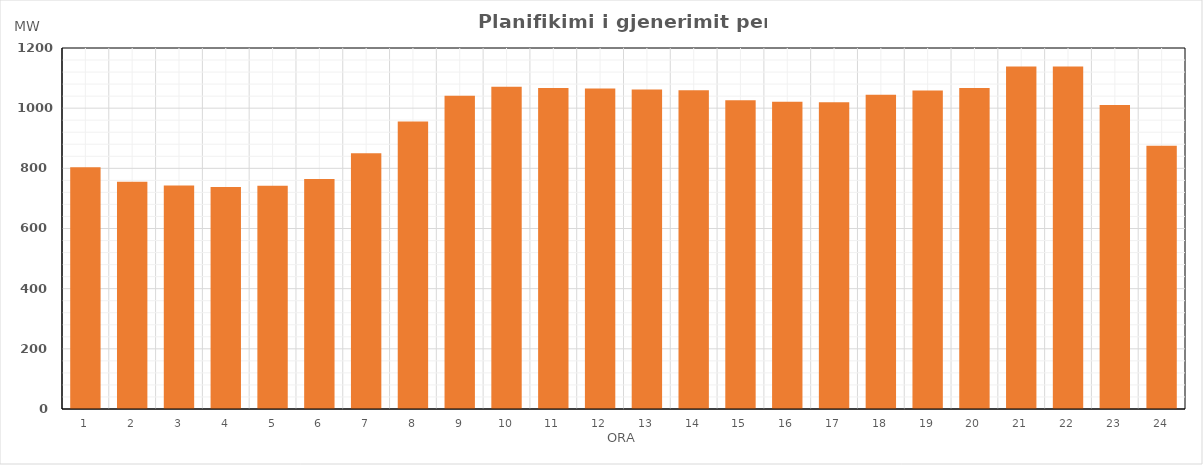
| Category | Max (MW) |
|---|---|
| 0 | 803.78 |
| 1 | 755.56 |
| 2 | 742.83 |
| 3 | 738.23 |
| 4 | 742.05 |
| 5 | 764.73 |
| 6 | 850.4 |
| 7 | 955.47 |
| 8 | 1040.92 |
| 9 | 1071.01 |
| 10 | 1066.81 |
| 11 | 1065.61 |
| 12 | 1061.93 |
| 13 | 1059.35 |
| 14 | 1026.08 |
| 15 | 1021.13 |
| 16 | 1019.72 |
| 17 | 1044.22 |
| 18 | 1058.35 |
| 19 | 1066.67 |
| 20 | 1138.63 |
| 21 | 1138.43 |
| 22 | 1010.47 |
| 23 | 875.13 |